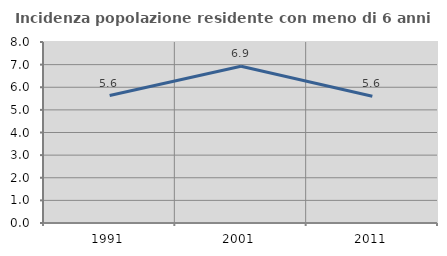
| Category | Incidenza popolazione residente con meno di 6 anni |
|---|---|
| 1991.0 | 5.632 |
| 2001.0 | 6.925 |
| 2011.0 | 5.604 |